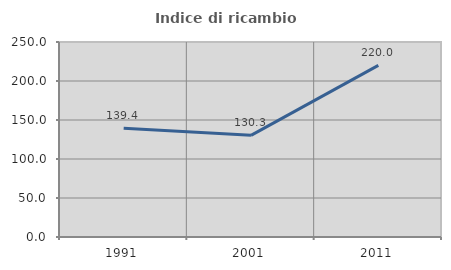
| Category | Indice di ricambio occupazionale  |
|---|---|
| 1991.0 | 139.394 |
| 2001.0 | 130.303 |
| 2011.0 | 220 |